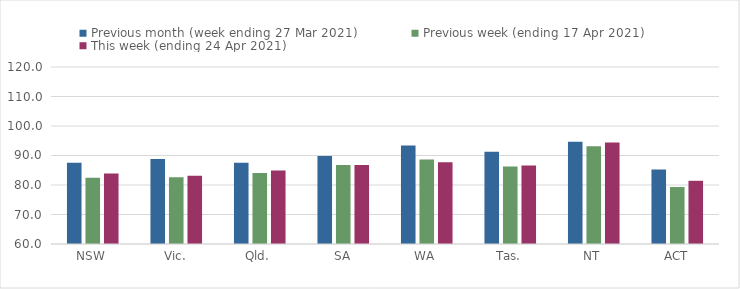
| Category | Previous month (week ending 27 Mar 2021) | Previous week (ending 17 Apr 2021) | This week (ending 24 Apr 2021) |
|---|---|---|---|
| NSW | 87.52 | 82.49 | 83.92 |
| Vic. | 88.81 | 82.6 | 83.12 |
| Qld. | 87.58 | 84.09 | 84.89 |
| SA | 89.87 | 86.8 | 86.8 |
| WA | 93.4 | 88.64 | 87.75 |
| Tas. | 91.23 | 86.29 | 86.6 |
| NT | 94.63 | 93.12 | 94.44 |
| ACT | 85.28 | 79.31 | 81.43 |